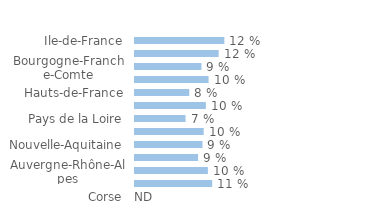
| Category | Series 0 |
|---|---|
| Ile-de-France | 0.124 |
| Centre-Val-de-Loire | 0.116 |
| Bourgogne-Franche-Comte | 0.092 |
| Normandie | 0.102 |
| Hauts-de-France | 0.075 |
| Grand-Est | 0.098 |
| Pays de la Loire | 0.07 |
| Bretagne | 0.095 |
| Nouvelle-Aquitaine | 0.094 |
| Occitanie | 0.088 |
| Auvergne-Rhône-Alpes | 0.101 |
| Provence-Alpes-Côte d'Azur | 0.107 |
| Corse | 0 |